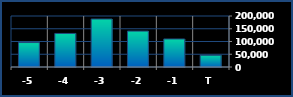
| Category | Series 0 |
|---|---|
| T | 46131 |
| -1 | 109916 |
| -2 | 140839 |
| -3 | 188184 |
| -4 | 131591 |
| -5 | 95873 |